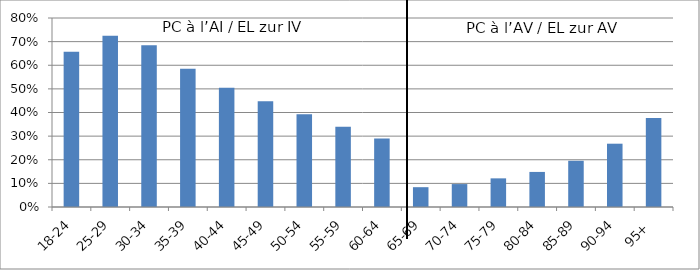
| Category | PC à l’AI / EL zur IV PC à l’AV / EL zur AV |
|---|---|
| 18-24 | 0.658 |
| 25-29 | 0.725 |
| 30-34 | 0.685 |
| 35-39 | 0.585 |
| 40-44 | 0.505 |
| 45-49 | 0.448 |
| 50-54 | 0.393 |
| 55-59 | 0.34 |
| 60-64 | 0.29 |
| 65-69 | 0.084 |
| 70-74 | 0.097 |
| 75-79 | 0.121 |
| 80-84 | 0.148 |
| 85-89 | 0.196 |
| 90-94 | 0.268 |
| 95+ | 0.377 |